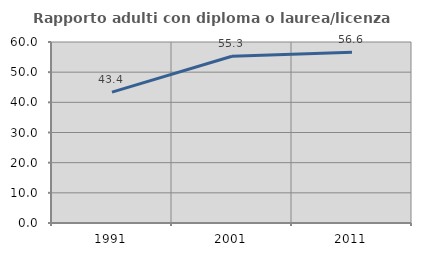
| Category | Rapporto adulti con diploma o laurea/licenza media  |
|---|---|
| 1991.0 | 43.396 |
| 2001.0 | 55.276 |
| 2011.0 | 56.561 |